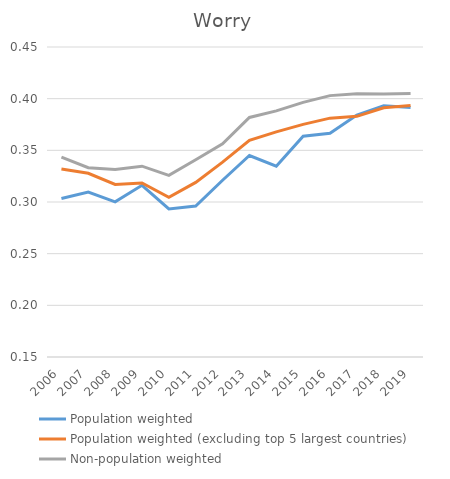
| Category | Population weighted | Population weighted (excluding top 5 largest countries) | Non-population weighted |
|---|---|---|---|
| 2006.0 | 0.303 | 0.332 | 0.343 |
| 2007.0 | 0.31 | 0.328 | 0.333 |
| 2008.0 | 0.3 | 0.317 | 0.331 |
| 2009.0 | 0.316 | 0.318 | 0.335 |
| 2010.0 | 0.293 | 0.305 | 0.326 |
| 2011.0 | 0.296 | 0.319 | 0.341 |
| 2012.0 | 0.321 | 0.339 | 0.356 |
| 2013.0 | 0.345 | 0.36 | 0.382 |
| 2014.0 | 0.335 | 0.368 | 0.388 |
| 2015.0 | 0.364 | 0.375 | 0.396 |
| 2016.0 | 0.366 | 0.381 | 0.403 |
| 2017.0 | 0.384 | 0.383 | 0.405 |
| 2018.0 | 0.393 | 0.391 | 0.404 |
| 2019.0 | 0.392 | 0.393 | 0.405 |